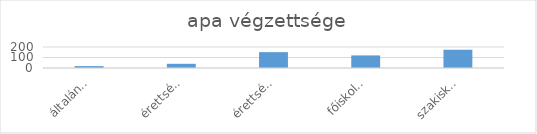
| Category | Series 0 |
|---|---|
| általános iskola | 18 |
| érettségi | 40 |
| érettségi+szakma | 151 |
| főiskola/egyetem | 120 |
| szakiskola | 174 |